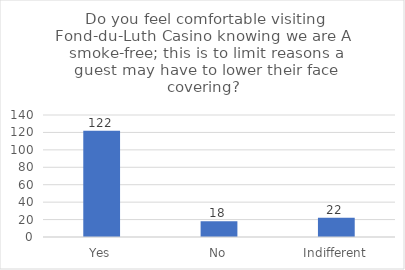
| Category | Series 0 |
|---|---|
| Yes | 122 |
| No | 18 |
| Indifferent | 22 |